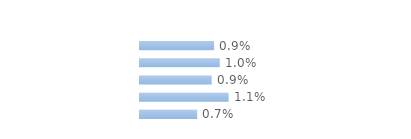
| Category | Series 0 |
|---|---|
| Communes rurales | 0.009 |
| moins de 20 000 hab. | 0.01 |
| 20 000 - 100 000 hab. | 0.009 |
| 100 000 hab. ou plus | 0.011 |
| Agglomération parisienne | 0.007 |